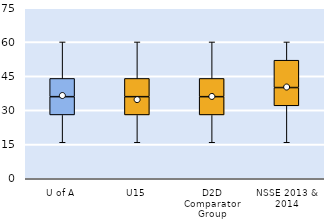
| Category | 25th | 50th | 75th |
|---|---|---|---|
| U of A | 28 | 8 | 8 |
| U15 | 28 | 8 | 8 |
| D2D Comparator Group | 28 | 8 | 8 |
| NSSE 2013 & 2014 | 32 | 8 | 12 |